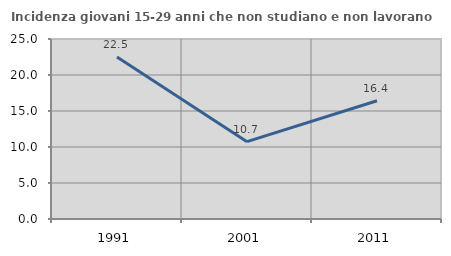
| Category | Incidenza giovani 15-29 anni che non studiano e non lavorano  |
|---|---|
| 1991.0 | 22.491 |
| 2001.0 | 10.743 |
| 2011.0 | 16.421 |